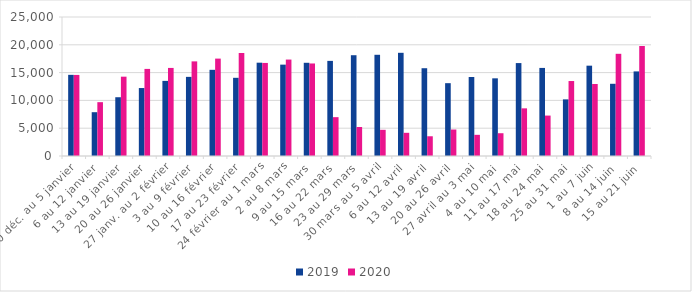
| Category | 2019 | 2020 |
|---|---|---|
| 30 déc. au 5 janvier | 14597 | 14581 |
| 6 au 12 janvier | 7879 | 9683 |
| 13 au 19 janvier | 10570 | 14267 |
| 20 au 26 janvier | 12222 | 15664 |
| 27 janv. au 2 février | 13510 | 15840 |
| 3 au 9 février | 14232 | 17019 |
| 10 au 16 février | 15499 | 17517 |
| 17 au 23 février | 14063 | 18529 |
| 24 février au 1 mars | 16783 | 16737 |
| 2 au 8 mars | 16432 | 17344.5 |
| 9 au 15 mars | 16765 | 16641.5 |
| 16 au 22 mars | 17107 | 6986 |
| 23 au 29 mars | 18126 | 5212 |
| 30 mars au 5 avril | 18204 | 4708 |
| 6 au 12 avril | 18560 | 4170 |
| 13 au 19 avril | 15788 | 3549 |
| 20 au 26 avril | 13099 | 4762 |
| 27 avril au 3 mai | 14207 | 3808 |
| 4 au 10 mai | 13969 | 4096 |
| 11 au 17 mai | 16713 | 8570 |
| 18 au 24 mai | 15841 | 7271 |
| 25 au 31 mai | 10184 | 13484 |
| 1 au 7 juin | 16246 | 12955 |
| 8 au 14 juin | 12988 | 18381 |
| 15 au 21 juin | 15214 | 19784 |